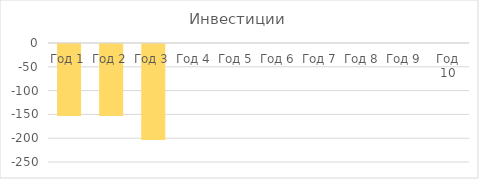
| Category | Инвестиции |
|---|---|
| Год 1 | -151.2 |
| Год 2 | -151.2 |
| Год 3 | -201.6 |
| Год 4 | 0 |
| Год 5 | 0 |
| Год 6 | 0 |
| Год 7 | 0 |
| Год 8 | 0 |
| Год 9 | 0 |
| Год 10 | 0 |